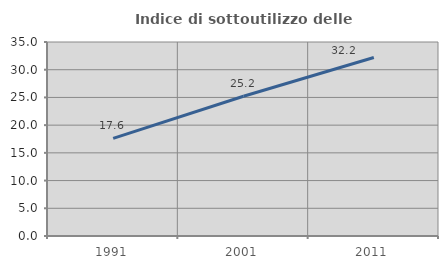
| Category | Indice di sottoutilizzo delle abitazioni  |
|---|---|
| 1991.0 | 17.62 |
| 2001.0 | 25.22 |
| 2011.0 | 32.213 |